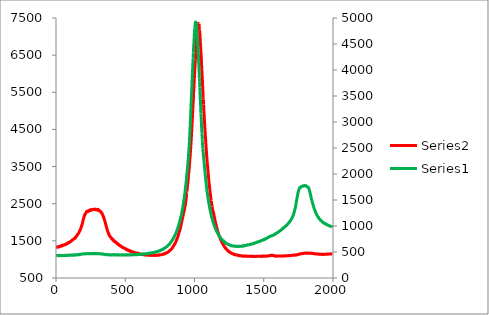
| Category | Series 5 |
|---|---|
| 0.0 | 1324.341 |
| 1.6 | 1326.57 |
| 3.2 | 1333.722 |
| 4.800000000000001 | 1335.591 |
| 6.4 | 1329.403 |
| 8.0 | 1330.224 |
| 9.600000000000001 | 1332.106 |
| 11.200000000000001 | 1327.205 |
| 12.8 | 1332.421 |
| 14.4 | 1339.326 |
| 16.0 | 1337.66 |
| 17.6 | 1343.187 |
| 19.200000000000003 | 1335.721 |
| 20.8 | 1338.657 |
| 22.400000000000002 | 1347.698 |
| 24.0 | 1349.644 |
| 25.6 | 1342.042 |
| 27.200000000000003 | 1355.066 |
| 28.8 | 1350.707 |
| 30.400000000000002 | 1349.752 |
| 32.0 | 1359.852 |
| 33.6 | 1351.822 |
| 35.2 | 1358.466 |
| 36.800000000000004 | 1359.272 |
| 38.400000000000006 | 1364.168 |
| 40.0 | 1372.816 |
| 41.6 | 1372.552 |
| 43.2 | 1370.27 |
| 44.800000000000004 | 1366.832 |
| 46.400000000000006 | 1384.65 |
| 48.0 | 1375.282 |
| 49.6 | 1381.134 |
| 51.2 | 1377.741 |
| 52.800000000000004 | 1381.258 |
| 54.400000000000006 | 1390.318 |
| 56.0 | 1385.906 |
| 57.6 | 1388.036 |
| 59.2 | 1390.409 |
| 60.800000000000004 | 1390.847 |
| 62.400000000000006 | 1395.918 |
| 64.0 | 1395.008 |
| 65.60000000000001 | 1403.968 |
| 67.2 | 1411.637 |
| 68.8 | 1410.423 |
| 70.4 | 1406.29 |
| 72.0 | 1400.998 |
| 73.60000000000001 | 1408.75 |
| 75.2 | 1419.637 |
| 76.80000000000001 | 1420.764 |
| 78.4 | 1422.688 |
| 80.0 | 1426.918 |
| 81.60000000000001 | 1434.733 |
| 83.2 | 1438.332 |
| 84.80000000000001 | 1427.938 |
| 86.4 | 1438.434 |
| 88.0 | 1437.954 |
| 89.60000000000001 | 1454.275 |
| 91.2 | 1451.526 |
| 92.80000000000001 | 1451.974 |
| 94.4 | 1459.619 |
| 96.0 | 1463.713 |
| 97.60000000000001 | 1460.511 |
| 99.2 | 1471.008 |
| 100.80000000000001 | 1470.978 |
| 102.4 | 1472.253 |
| 104.0 | 1479.637 |
| 105.60000000000001 | 1489.19 |
| 107.2 | 1485.202 |
| 108.80000000000001 | 1491.216 |
| 110.4 | 1491.536 |
| 112.0 | 1500.481 |
| 113.60000000000001 | 1499.62 |
| 115.2 | 1507.443 |
| 116.80000000000001 | 1522.002 |
| 118.4 | 1518.037 |
| 120.0 | 1525.903 |
| 121.60000000000001 | 1533.27 |
| 123.2 | 1535.716 |
| 124.80000000000001 | 1537.775 |
| 126.4 | 1542.262 |
| 128.0 | 1545.485 |
| 129.6 | 1546.73 |
| 131.20000000000002 | 1559.718 |
| 132.8 | 1568.369 |
| 134.4 | 1577.265 |
| 136.0 | 1575.478 |
| 137.6 | 1581.012 |
| 139.20000000000002 | 1572.298 |
| 140.8 | 1594.202 |
| 142.4 | 1601.198 |
| 144.0 | 1607.495 |
| 145.6 | 1612.786 |
| 147.20000000000002 | 1622.685 |
| 148.8 | 1624.009 |
| 150.4 | 1641.332 |
| 152.0 | 1654.599 |
| 153.60000000000002 | 1661.69 |
| 155.20000000000002 | 1666.176 |
| 156.8 | 1674.4 |
| 158.4 | 1679.424 |
| 160.0 | 1691.205 |
| 161.60000000000002 | 1696.826 |
| 163.20000000000002 | 1710.934 |
| 164.8 | 1715.19 |
| 166.4 | 1727.58 |
| 168.0 | 1741.528 |
| 169.60000000000002 | 1756.216 |
| 171.20000000000002 | 1774.472 |
| 172.8 | 1773.262 |
| 174.4 | 1790.864 |
| 176.0 | 1806.335 |
| 177.60000000000002 | 1821.769 |
| 179.20000000000002 | 1837.88 |
| 180.8 | 1861.466 |
| 182.4 | 1871.338 |
| 184.0 | 1904.16 |
| 185.60000000000002 | 1910.105 |
| 187.20000000000002 | 1918.326 |
| 188.8 | 1949.704 |
| 190.4 | 1968.485 |
| 192.0 | 2008.512 |
| 193.60000000000002 | 2014.827 |
| 195.20000000000002 | 2047.869 |
| 196.8 | 2072.574 |
| 198.4 | 2105.614 |
| 200.0 | 2112.448 |
| 201.60000000000002 | 2138.054 |
| 203.20000000000002 | 2160.148 |
| 204.8 | 2168.116 |
| 206.4 | 2191.64 |
| 208.0 | 2213.401 |
| 209.60000000000002 | 2218.988 |
| 211.20000000000002 | 2216.191 |
| 212.8 | 2234.648 |
| 214.4 | 2240.574 |
| 216.0 | 2249.847 |
| 217.60000000000002 | 2259.454 |
| 219.20000000000002 | 2277.722 |
| 220.8 | 2290.735 |
| 222.4 | 2283.333 |
| 224.0 | 2296.376 |
| 225.60000000000002 | 2293.815 |
| 227.20000000000002 | 2287.881 |
| 228.8 | 2296.412 |
| 230.4 | 2299.645 |
| 232.0 | 2306.858 |
| 233.60000000000002 | 2291.586 |
| 235.20000000000002 | 2301.935 |
| 236.8 | 2306.563 |
| 238.4 | 2305.196 |
| 240.0 | 2317.256 |
| 241.60000000000002 | 2325.503 |
| 243.20000000000002 | 2329.208 |
| 244.8 | 2324.063 |
| 246.4 | 2320.741 |
| 248.0 | 2339.082 |
| 249.60000000000002 | 2329.952 |
| 251.20000000000002 | 2326.417 |
| 252.8 | 2321.756 |
| 254.4 | 2338.04 |
| 256.0 | 2340.27 |
| 257.6 | 2335.792 |
| 259.2 | 2344.923 |
| 260.8 | 2337.247 |
| 262.40000000000003 | 2337.164 |
| 264.0 | 2345.56 |
| 265.6 | 2342.88 |
| 267.2 | 2340.491 |
| 268.8 | 2338.908 |
| 270.40000000000003 | 2347.08 |
| 272.0 | 2348.049 |
| 273.6 | 2353.1 |
| 275.2 | 2344.894 |
| 276.8 | 2344.765 |
| 278.40000000000003 | 2348.178 |
| 280.0 | 2347.974 |
| 281.6 | 2350.356 |
| 283.2 | 2356.236 |
| 284.8 | 2348.687 |
| 286.40000000000003 | 2351.279 |
| 288.0 | 2343.963 |
| 289.6 | 2346.088 |
| 291.2 | 2329.069 |
| 292.8 | 2336.701 |
| 294.40000000000003 | 2341.272 |
| 296.0 | 2337.596 |
| 297.6 | 2341.08 |
| 299.2 | 2331.138 |
| 300.8 | 2340.833 |
| 302.40000000000003 | 2327.022 |
| 304.0 | 2349.039 |
| 305.6 | 2331.014 |
| 307.20000000000005 | 2331.934 |
| 308.8 | 2328.81 |
| 310.40000000000003 | 2309.239 |
| 312.0 | 2322.295 |
| 313.6 | 2304.965 |
| 315.20000000000005 | 2302.066 |
| 316.8 | 2309.644 |
| 318.40000000000003 | 2301.216 |
| 320.0 | 2301.114 |
| 321.6 | 2293.679 |
| 323.20000000000005 | 2277.085 |
| 324.8 | 2272.066 |
| 326.40000000000003 | 2270.261 |
| 328.0 | 2256.552 |
| 329.6 | 2248.376 |
| 331.20000000000005 | 2247.178 |
| 332.8 | 2232.44 |
| 334.40000000000003 | 2221.242 |
| 336.0 | 2211.995 |
| 337.6 | 2201.296 |
| 339.20000000000005 | 2166.758 |
| 340.8 | 2165.451 |
| 342.40000000000003 | 2157.285 |
| 344.0 | 2134.909 |
| 345.6 | 2110.182 |
| 347.20000000000005 | 2100.73 |
| 348.8 | 2073.644 |
| 350.40000000000003 | 2062.537 |
| 352.0 | 2038.525 |
| 353.6 | 2022.318 |
| 355.20000000000005 | 2000.674 |
| 356.8 | 1983.594 |
| 358.40000000000003 | 1951.045 |
| 360.0 | 1937.364 |
| 361.6 | 1910.355 |
| 363.20000000000005 | 1886.389 |
| 364.8 | 1862.691 |
| 366.40000000000003 | 1847.719 |
| 368.0 | 1813.714 |
| 369.6 | 1803.546 |
| 371.20000000000005 | 1784.988 |
| 372.8 | 1752.58 |
| 374.40000000000003 | 1743.131 |
| 376.0 | 1729.27 |
| 377.6 | 1716.48 |
| 379.20000000000005 | 1694.377 |
| 380.8 | 1688.111 |
| 382.40000000000003 | 1686.258 |
| 384.0 | 1656.023 |
| 385.6 | 1640.846 |
| 387.20000000000005 | 1632.377 |
| 388.8 | 1630.903 |
| 390.40000000000003 | 1619.094 |
| 392.0 | 1615.142 |
| 393.6 | 1605.597 |
| 395.20000000000005 | 1598.903 |
| 396.8 | 1584.915 |
| 398.40000000000003 | 1578.512 |
| 400.0 | 1570.286 |
| 401.6 | 1564.241 |
| 403.20000000000005 | 1549.062 |
| 404.8 | 1554.793 |
| 406.40000000000003 | 1540.039 |
| 408.0 | 1551.816 |
| 409.6 | 1534.42 |
| 411.20000000000005 | 1537.259 |
| 412.8 | 1511.648 |
| 414.40000000000003 | 1509.086 |
| 416.0 | 1507.205 |
| 417.6 | 1495.531 |
| 419.20000000000005 | 1502.13 |
| 420.8 | 1486.435 |
| 422.40000000000003 | 1486.782 |
| 424.0 | 1482.877 |
| 425.6 | 1469.866 |
| 427.20000000000005 | 1466.395 |
| 428.8 | 1473.051 |
| 430.40000000000003 | 1471.897 |
| 432.0 | 1469.366 |
| 433.6 | 1458.806 |
| 435.20000000000005 | 1455.588 |
| 436.8 | 1449.995 |
| 438.40000000000003 | 1441.219 |
| 440.0 | 1438.059 |
| 441.6 | 1422.728 |
| 443.20000000000005 | 1428.178 |
| 444.8 | 1419.941 |
| 446.40000000000003 | 1416.731 |
| 448.0 | 1409.21 |
| 449.6 | 1396.423 |
| 451.20000000000005 | 1411.684 |
| 452.8 | 1392.318 |
| 454.40000000000003 | 1394.022 |
| 456.0 | 1389.702 |
| 457.6 | 1380.086 |
| 459.20000000000005 | 1377.704 |
| 460.8 | 1369.318 |
| 462.40000000000003 | 1363.821 |
| 464.0 | 1363.144 |
| 465.6 | 1372.739 |
| 467.20000000000005 | 1360.059 |
| 468.8 | 1360.622 |
| 470.40000000000003 | 1349.421 |
| 472.0 | 1352.184 |
| 473.6 | 1340.684 |
| 475.20000000000005 | 1334.44 |
| 476.8 | 1334.042 |
| 478.40000000000003 | 1330.157 |
| 480.0 | 1327.19 |
| 481.6 | 1323.409 |
| 483.20000000000005 | 1317.002 |
| 484.8 | 1317.693 |
| 486.40000000000003 | 1321.31 |
| 488.0 | 1313.551 |
| 489.6 | 1307.94 |
| 491.20000000000005 | 1305.878 |
| 492.8 | 1300.816 |
| 494.40000000000003 | 1302.537 |
| 496.0 | 1296.818 |
| 497.6 | 1297.545 |
| 499.20000000000005 | 1291.748 |
| 500.8 | 1282.258 |
| 502.40000000000003 | 1285.335 |
| 504.0 | 1278.256 |
| 505.6 | 1274.502 |
| 507.20000000000005 | 1266.523 |
| 508.8 | 1278.469 |
| 510.40000000000003 | 1271.57 |
| 512.0 | 1258.571 |
| 513.6 | 1261.935 |
| 515.2 | 1257.892 |
| 516.8000000000001 | 1258.489 |
| 518.4 | 1250.665 |
| 520.0 | 1244.727 |
| 521.6 | 1237.711 |
| 523.2 | 1249.801 |
| 524.8000000000001 | 1237.062 |
| 526.4 | 1250.86 |
| 528.0 | 1238.012 |
| 529.6 | 1227.96 |
| 531.2 | 1236.262 |
| 532.8000000000001 | 1231.512 |
| 534.4 | 1220.492 |
| 536.0 | 1225.015 |
| 537.6 | 1221.742 |
| 539.2 | 1210.481 |
| 540.8000000000001 | 1212.85 |
| 542.4 | 1212.656 |
| 544.0 | 1205.505 |
| 545.6 | 1212.971 |
| 547.2 | 1207.179 |
| 548.8000000000001 | 1213.144 |
| 550.4 | 1207.417 |
| 552.0 | 1195.94 |
| 553.6 | 1202.159 |
| 555.2 | 1194.106 |
| 556.8000000000001 | 1197.954 |
| 558.4 | 1191.949 |
| 560.0 | 1187.108 |
| 561.6 | 1190.256 |
| 563.2 | 1187.975 |
| 564.8000000000001 | 1190.068 |
| 566.4 | 1184.062 |
| 568.0 | 1184.596 |
| 569.6 | 1183.281 |
| 571.2 | 1180.103 |
| 572.8000000000001 | 1175.653 |
| 574.4 | 1173.162 |
| 576.0 | 1173.214 |
| 577.6 | 1167.017 |
| 579.2 | 1167.634 |
| 580.8000000000001 | 1168.583 |
| 582.4 | 1174.724 |
| 584.0 | 1161.563 |
| 585.6 | 1166.593 |
| 587.2 | 1165.992 |
| 588.8000000000001 | 1162.207 |
| 590.4 | 1173.62 |
| 592.0 | 1156.441 |
| 593.6 | 1158.125 |
| 595.2 | 1154.097 |
| 596.8000000000001 | 1150.214 |
| 598.4 | 1153.62 |
| 600.0 | 1148.096 |
| 601.6 | 1145.387 |
| 603.2 | 1145.506 |
| 604.8000000000001 | 1149.952 |
| 606.4 | 1147.673 |
| 608.0 | 1147.051 |
| 609.6 | 1141.684 |
| 611.2 | 1144.981 |
| 612.8000000000001 | 1140.011 |
| 614.4000000000001 | 1140.818 |
| 616.0 | 1137.707 |
| 617.6 | 1133.721 |
| 619.2 | 1139.71 |
| 620.8000000000001 | 1138.994 |
| 622.4000000000001 | 1133.344 |
| 624.0 | 1134.301 |
| 625.6 | 1128.097 |
| 627.2 | 1135.804 |
| 628.8000000000001 | 1133.31 |
| 630.4000000000001 | 1130.003 |
| 632.0 | 1128.461 |
| 633.6 | 1128.526 |
| 635.2 | 1126.515 |
| 636.8000000000001 | 1126.31 |
| 638.4000000000001 | 1120.469 |
| 640.0 | 1131.829 |
| 641.6 | 1123.173 |
| 643.2 | 1125.866 |
| 644.8000000000001 | 1118.653 |
| 646.4000000000001 | 1122.052 |
| 648.0 | 1123.557 |
| 649.6 | 1120.332 |
| 651.2 | 1117.395 |
| 652.8000000000001 | 1123.796 |
| 654.4000000000001 | 1114.923 |
| 656.0 | 1121.455 |
| 657.6 | 1123.778 |
| 659.2 | 1116.543 |
| 660.8000000000001 | 1125.202 |
| 662.4000000000001 | 1118.429 |
| 664.0 | 1122.344 |
| 665.6 | 1110.485 |
| 667.2 | 1112.926 |
| 668.8000000000001 | 1113.509 |
| 670.4000000000001 | 1112.738 |
| 672.0 | 1116.861 |
| 673.6 | 1111.326 |
| 675.2 | 1109.602 |
| 676.8000000000001 | 1114.298 |
| 678.4000000000001 | 1113.117 |
| 680.0 | 1114.045 |
| 681.6 | 1114.299 |
| 683.2 | 1112.414 |
| 684.8000000000001 | 1106.193 |
| 686.4000000000001 | 1110.193 |
| 688.0 | 1116.644 |
| 689.6 | 1110.971 |
| 691.2 | 1110.702 |
| 692.8000000000001 | 1112.748 |
| 694.4000000000001 | 1113.909 |
| 696.0 | 1113.593 |
| 697.6 | 1110.063 |
| 699.2 | 1109.877 |
| 700.8000000000001 | 1106.66 |
| 702.4000000000001 | 1113.233 |
| 704.0 | 1110.793 |
| 705.6 | 1112.557 |
| 707.2 | 1113.472 |
| 708.8000000000001 | 1110.591 |
| 710.4000000000001 | 1110.106 |
| 712.0 | 1106.699 |
| 713.6 | 1115.154 |
| 715.2 | 1110.454 |
| 716.8000000000001 | 1118.105 |
| 718.4000000000001 | 1112.742 |
| 720.0 | 1109.634 |
| 721.6 | 1116.35 |
| 723.2 | 1112.909 |
| 724.8000000000001 | 1106.961 |
| 726.4000000000001 | 1111.336 |
| 728.0 | 1109.159 |
| 729.6 | 1118.247 |
| 731.2 | 1116.65 |
| 732.8000000000001 | 1115.474 |
| 734.4000000000001 | 1118.415 |
| 736.0 | 1115.156 |
| 737.6 | 1114.722 |
| 739.2 | 1122.523 |
| 740.8000000000001 | 1117.448 |
| 742.4000000000001 | 1112.485 |
| 744.0 | 1117.969 |
| 745.6 | 1120.466 |
| 747.2 | 1124.566 |
| 748.8000000000001 | 1119.57 |
| 750.4000000000001 | 1124.179 |
| 752.0 | 1122.167 |
| 753.6 | 1124.31 |
| 755.2 | 1123.608 |
| 756.8000000000001 | 1123.764 |
| 758.4000000000001 | 1127.619 |
| 760.0 | 1127.134 |
| 761.6 | 1126.162 |
| 763.2 | 1131.347 |
| 764.8000000000001 | 1134.424 |
| 766.4000000000001 | 1133.637 |
| 768.0 | 1132.946 |
| 769.6 | 1139.532 |
| 771.2 | 1143.372 |
| 772.8000000000001 | 1145.512 |
| 774.4000000000001 | 1137.457 |
| 776.0 | 1145.119 |
| 777.6 | 1141.659 |
| 779.2 | 1143.123 |
| 780.8000000000001 | 1147.918 |
| 782.4000000000001 | 1149.554 |
| 784.0 | 1157.025 |
| 785.6 | 1151.923 |
| 787.2 | 1150.883 |
| 788.8000000000001 | 1157.344 |
| 790.4000000000001 | 1159.046 |
| 792.0 | 1167.952 |
| 793.6 | 1174.545 |
| 795.2 | 1176.767 |
| 796.8000000000001 | 1175.886 |
| 798.4000000000001 | 1182.998 |
| 800.0 | 1182.301 |
| 801.6 | 1179.917 |
| 803.2 | 1186.671 |
| 804.8000000000001 | 1193.252 |
| 806.4000000000001 | 1195.448 |
| 808.0 | 1192.282 |
| 809.6 | 1201.16 |
| 811.2 | 1207.969 |
| 812.8000000000001 | 1209.377 |
| 814.4000000000001 | 1217.647 |
| 816.0 | 1215.847 |
| 817.6 | 1227.093 |
| 819.2 | 1229.492 |
| 820.8000000000001 | 1236.201 |
| 822.4000000000001 | 1243.637 |
| 824.0 | 1242.184 |
| 825.6 | 1252.699 |
| 827.2 | 1254.602 |
| 828.8000000000001 | 1265.224 |
| 830.4000000000001 | 1271.231 |
| 832.0 | 1276.009 |
| 833.6 | 1281.489 |
| 835.2 | 1287.952 |
| 836.8000000000001 | 1291.767 |
| 838.4000000000001 | 1302.85 |
| 840.0 | 1308.042 |
| 841.6 | 1318.299 |
| 843.2 | 1331.849 |
| 844.8000000000001 | 1341.542 |
| 846.4000000000001 | 1354.292 |
| 848.0 | 1366.134 |
| 849.6 | 1360.248 |
| 851.2 | 1380.832 |
| 852.8000000000001 | 1392.57 |
| 854.4000000000001 | 1405.356 |
| 856.0 | 1409.386 |
| 857.6 | 1422.633 |
| 859.2 | 1428.394 |
| 860.8000000000001 | 1436.333 |
| 862.4000000000001 | 1446.934 |
| 864.0 | 1464.957 |
| 865.6 | 1482.611 |
| 867.2 | 1494.525 |
| 868.8000000000001 | 1505.36 |
| 870.4000000000001 | 1520.554 |
| 872.0 | 1532.719 |
| 873.6 | 1554.497 |
| 875.2 | 1570.525 |
| 876.8000000000001 | 1579.35 |
| 878.4000000000001 | 1601.262 |
| 880.0 | 1617.694 |
| 881.6 | 1632.253 |
| 883.2 | 1650.972 |
| 884.8000000000001 | 1674.863 |
| 886.4000000000001 | 1695.739 |
| 888.0 | 1710.602 |
| 889.6 | 1736.113 |
| 891.2 | 1755.228 |
| 892.8000000000001 | 1768.202 |
| 894.4000000000001 | 1786.667 |
| 896.0 | 1814.582 |
| 897.6 | 1836.978 |
| 899.2 | 1865.799 |
| 900.8000000000001 | 1891.062 |
| 902.4000000000001 | 1911.338 |
| 904.0 | 1949.403 |
| 905.6 | 1974.511 |
| 907.2 | 1996.12 |
| 908.8000000000001 | 2032.36 |
| 910.4000000000001 | 2058.148 |
| 912.0 | 2085.619 |
| 913.6 | 2109.148 |
| 915.2 | 2147.164 |
| 916.8000000000001 | 2165.526 |
| 918.4000000000001 | 2203.256 |
| 920.0 | 2219.091 |
| 921.6 | 2253.181 |
| 923.2 | 2291.034 |
| 924.8000000000001 | 2297.361 |
| 926.4000000000001 | 2335.269 |
| 928.0 | 2357.052 |
| 929.6 | 2401.367 |
| 931.2 | 2437.034 |
| 932.8000000000001 | 2447.381 |
| 934.4000000000001 | 2489.181 |
| 936.0 | 2543.378 |
| 937.6 | 2584.336 |
| 939.2 | 2636.193 |
| 940.8000000000001 | 2671.869 |
| 942.4000000000001 | 2759.461 |
| 944.0 | 2816.289 |
| 945.6 | 2822.052 |
| 947.2 | 2899.225 |
| 948.8000000000001 | 2972.963 |
| 950.4000000000001 | 3030.292 |
| 952.0 | 3062.046 |
| 953.6 | 3118.852 |
| 955.2 | 3203.572 |
| 956.8000000000001 | 3275.398 |
| 958.4000000000001 | 3328.854 |
| 960.0 | 3375.849 |
| 961.6 | 3458.765 |
| 963.2 | 3527.62 |
| 964.8000000000001 | 3599.424 |
| 966.4000000000001 | 3697.094 |
| 968.0 | 3747.724 |
| 969.6 | 3845.84 |
| 971.2 | 3921.835 |
| 972.8000000000001 | 4005.963 |
| 974.4000000000001 | 4133.694 |
| 976.0 | 4209.918 |
| 977.6 | 4306.622 |
| 979.2 | 4429.23 |
| 980.8000000000001 | 4548.318 |
| 982.4000000000001 | 4659.918 |
| 984.0 | 4757.301 |
| 985.6 | 4881.557 |
| 987.2 | 4988.446 |
| 988.8000000000001 | 5116.168 |
| 990.4000000000001 | 5229.016 |
| 992.0 | 5341.854 |
| 993.6 | 5492.117 |
| 995.2 | 5584.961 |
| 996.8000000000001 | 5719.781 |
| 998.4000000000001 | 5844.003 |
| 1000.0 | 5946.714 |
| 1001.6 | 6064.936 |
| 1003.2 | 6178.662 |
| 1004.8000000000001 | 6297.387 |
| 1006.4000000000001 | 6375.176 |
| 1008.0 | 6535.298 |
| 1009.6 | 6631.468 |
| 1011.2 | 6696.746 |
| 1012.8000000000001 | 6804.148 |
| 1014.4000000000001 | 6902.571 |
| 1016.0 | 6986.086 |
| 1017.6 | 7090.739 |
| 1019.2 | 7126.137 |
| 1020.8000000000001 | 7222.126 |
| 1022.4000000000001 | 7281.543 |
| 1024.0 | 7309.779 |
| 1025.6000000000001 | 7318.963 |
| 1027.2 | 7356.089 |
| 1028.8 | 7335.31 |
| 1030.4 | 7319.58 |
| 1032.0 | 7344.58 |
| 1033.6000000000001 | 7286.974 |
| 1035.2 | 7176.776 |
| 1036.8 | 7170.431 |
| 1038.4 | 7105.011 |
| 1040.0 | 7009.5 |
| 1041.6000000000001 | 6875.248 |
| 1043.2 | 6796.153 |
| 1044.8 | 6683.736 |
| 1046.4 | 6570.556 |
| 1048.0 | 6482.707 |
| 1049.6000000000001 | 6365.545 |
| 1051.2 | 6222.994 |
| 1052.8 | 6124.312 |
| 1054.4 | 5991.705 |
| 1056.0 | 5897.483 |
| 1057.6000000000001 | 5759.557 |
| 1059.2 | 5646.815 |
| 1060.8 | 5523.941 |
| 1062.4 | 5352.983 |
| 1064.0 | 5300.514 |
| 1065.6000000000001 | 5171.406 |
| 1067.2 | 5043.278 |
| 1068.8 | 4928.404 |
| 1070.4 | 4848.497 |
| 1072.0 | 4721.233 |
| 1073.6000000000001 | 4638.157 |
| 1075.2 | 4516.516 |
| 1076.8 | 4429.823 |
| 1078.4 | 4311.867 |
| 1080.0 | 4248.861 |
| 1081.6000000000001 | 4151.014 |
| 1083.2 | 4047.09 |
| 1084.8 | 3967.604 |
| 1086.4 | 3873.515 |
| 1088.0 | 3802.812 |
| 1089.6000000000001 | 3723.068 |
| 1091.2 | 3642.881 |
| 1092.8 | 3559.165 |
| 1094.4 | 3523.211 |
| 1096.0 | 3444.429 |
| 1097.6000000000001 | 3368.847 |
| 1099.2 | 3300.785 |
| 1100.8 | 3241.75 |
| 1102.4 | 3175.258 |
| 1104.0 | 3098.398 |
| 1105.6000000000001 | 3040.688 |
| 1107.2 | 3007.662 |
| 1108.8 | 2940.245 |
| 1110.4 | 2886.002 |
| 1112.0 | 2822.006 |
| 1113.6000000000001 | 2785.079 |
| 1115.2 | 2752.136 |
| 1116.8 | 2678.046 |
| 1118.4 | 2633.682 |
| 1120.0 | 2587.606 |
| 1121.6000000000001 | 2579.571 |
| 1123.2 | 2488.162 |
| 1124.8 | 2491.798 |
| 1126.4 | 2427.048 |
| 1128.0 | 2400.813 |
| 1129.6000000000001 | 2351.874 |
| 1131.2 | 2338.211 |
| 1132.8 | 2313.586 |
| 1134.4 | 2287.042 |
| 1136.0 | 2266.332 |
| 1137.6000000000001 | 2247.591 |
| 1139.2 | 2212.767 |
| 1140.8 | 2187.781 |
| 1142.4 | 2148.73 |
| 1144.0 | 2133.679 |
| 1145.6000000000001 | 2100.932 |
| 1147.2 | 2070.61 |
| 1148.8 | 2050.573 |
| 1150.4 | 2008.492 |
| 1152.0 | 1992.917 |
| 1153.6000000000001 | 1959.404 |
| 1155.2 | 1931.134 |
| 1156.8 | 1926.928 |
| 1158.4 | 1880.98 |
| 1160.0 | 1863.341 |
| 1161.6000000000001 | 1832.779 |
| 1163.2 | 1820.44 |
| 1164.8 | 1796.191 |
| 1166.4 | 1774.887 |
| 1168.0 | 1753.923 |
| 1169.6000000000001 | 1737.503 |
| 1171.2 | 1720.336 |
| 1172.8 | 1691.841 |
| 1174.4 | 1673.343 |
| 1176.0 | 1663.639 |
| 1177.6000000000001 | 1646.846 |
| 1179.2 | 1621.441 |
| 1180.8 | 1610.64 |
| 1182.4 | 1599.142 |
| 1184.0 | 1592.468 |
| 1185.6000000000001 | 1568.4 |
| 1187.2 | 1545.373 |
| 1188.8 | 1547.687 |
| 1190.4 | 1524.617 |
| 1192.0 | 1506.42 |
| 1193.6000000000001 | 1500.568 |
| 1195.2 | 1484.153 |
| 1196.8 | 1464.457 |
| 1198.4 | 1461.133 |
| 1200.0 | 1450.44 |
| 1201.6000000000001 | 1439.017 |
| 1203.2 | 1423.844 |
| 1204.8 | 1410.103 |
| 1206.4 | 1400.678 |
| 1208.0 | 1393.287 |
| 1209.6000000000001 | 1380.171 |
| 1211.2 | 1375.333 |
| 1212.8 | 1360.619 |
| 1214.4 | 1356.463 |
| 1216.0 | 1343.506 |
| 1217.6000000000001 | 1340.73 |
| 1219.2 | 1323.565 |
| 1220.8 | 1317.313 |
| 1222.4 | 1309.356 |
| 1224.0 | 1299.631 |
| 1225.6000000000001 | 1301.255 |
| 1227.2 | 1299.761 |
| 1228.8000000000002 | 1277.739 |
| 1230.4 | 1280.19 |
| 1232.0 | 1267.284 |
| 1233.6000000000001 | 1263.42 |
| 1235.2 | 1261.299 |
| 1236.8000000000002 | 1246.142 |
| 1238.4 | 1249.329 |
| 1240.0 | 1233.61 |
| 1241.6000000000001 | 1232.958 |
| 1243.2 | 1226.707 |
| 1244.8000000000002 | 1218.583 |
| 1246.4 | 1222.116 |
| 1248.0 | 1217.142 |
| 1249.6000000000001 | 1207.793 |
| 1251.2 | 1201.444 |
| 1252.8000000000002 | 1201.983 |
| 1254.4 | 1194.816 |
| 1256.0 | 1191.532 |
| 1257.6000000000001 | 1187.765 |
| 1259.2 | 1184.178 |
| 1260.8000000000002 | 1181.011 |
| 1262.4 | 1179.812 |
| 1264.0 | 1172.576 |
| 1265.6000000000001 | 1167.593 |
| 1267.2 | 1168.926 |
| 1268.8000000000002 | 1162.694 |
| 1270.4 | 1162.329 |
| 1272.0 | 1159.355 |
| 1273.6000000000001 | 1156.221 |
| 1275.2 | 1152.778 |
| 1276.8000000000002 | 1153.633 |
| 1278.4 | 1145.322 |
| 1280.0 | 1145.596 |
| 1281.6000000000001 | 1144.591 |
| 1283.2 | 1138.61 |
| 1284.8000000000002 | 1132.835 |
| 1286.4 | 1140.313 |
| 1288.0 | 1135.645 |
| 1289.6000000000001 | 1135.12 |
| 1291.2 | 1130.176 |
| 1292.8000000000002 | 1134.517 |
| 1294.4 | 1124.444 |
| 1296.0 | 1124.687 |
| 1297.6000000000001 | 1126.116 |
| 1299.2 | 1121.674 |
| 1300.8000000000002 | 1121.761 |
| 1302.4 | 1116.86 |
| 1304.0 | 1118.89 |
| 1305.6000000000001 | 1117.059 |
| 1307.2 | 1112.231 |
| 1308.8000000000002 | 1119.077 |
| 1310.4 | 1112.844 |
| 1312.0 | 1108.89 |
| 1313.6000000000001 | 1109.438 |
| 1315.2 | 1108.741 |
| 1316.8000000000002 | 1114.693 |
| 1318.4 | 1107.822 |
| 1320.0 | 1101.73 |
| 1321.6000000000001 | 1101.636 |
| 1323.2 | 1103.895 |
| 1324.8000000000002 | 1102.958 |
| 1326.4 | 1101.483 |
| 1328.0 | 1099.61 |
| 1329.6000000000001 | 1103.204 |
| 1331.2 | 1097.6 |
| 1332.8000000000002 | 1100.179 |
| 1334.4 | 1097.787 |
| 1336.0 | 1098.256 |
| 1337.6000000000001 | 1096.84 |
| 1339.2 | 1094.145 |
| 1340.8000000000002 | 1094.367 |
| 1342.4 | 1098.477 |
| 1344.0 | 1093.556 |
| 1345.6000000000001 | 1092.347 |
| 1347.2 | 1089.924 |
| 1348.8000000000002 | 1090.679 |
| 1350.4 | 1087.645 |
| 1352.0 | 1090.461 |
| 1353.6000000000001 | 1086.721 |
| 1355.2 | 1094.236 |
| 1356.8000000000002 | 1084.228 |
| 1358.4 | 1094.304 |
| 1360.0 | 1084.14 |
| 1361.6000000000001 | 1087.642 |
| 1363.2 | 1090.37 |
| 1364.8000000000002 | 1088.9 |
| 1366.4 | 1086.789 |
| 1368.0 | 1091.238 |
| 1369.6000000000001 | 1085.798 |
| 1371.2 | 1089.806 |
| 1372.8000000000002 | 1088.083 |
| 1374.4 | 1086.17 |
| 1376.0 | 1093.19 |
| 1377.6000000000001 | 1083.381 |
| 1379.2 | 1084.812 |
| 1380.8000000000002 | 1082.772 |
| 1382.4 | 1082.06 |
| 1384.0 | 1086.73 |
| 1385.6000000000001 | 1087.327 |
| 1387.2 | 1085.214 |
| 1388.8000000000002 | 1084.756 |
| 1390.4 | 1084.928 |
| 1392.0 | 1083.204 |
| 1393.6000000000001 | 1086.008 |
| 1395.2 | 1087.091 |
| 1396.8000000000002 | 1089.841 |
| 1398.4 | 1085.026 |
| 1400.0 | 1086.208 |
| 1401.6000000000001 | 1086.409 |
| 1403.2 | 1080.755 |
| 1404.8000000000002 | 1083.284 |
| 1406.4 | 1080.82 |
| 1408.0 | 1082.528 |
| 1409.6000000000001 | 1079.787 |
| 1411.2 | 1083.637 |
| 1412.8000000000002 | 1081.92 |
| 1414.4 | 1085.256 |
| 1416.0 | 1081.799 |
| 1417.6000000000001 | 1086.272 |
| 1419.2 | 1084.597 |
| 1420.8000000000002 | 1082.036 |
| 1422.4 | 1084.034 |
| 1424.0 | 1080.599 |
| 1425.6000000000001 | 1080.849 |
| 1427.2 | 1079.716 |
| 1428.8000000000002 | 1084.525 |
| 1430.4 | 1083.276 |
| 1432.0 | 1081.568 |
| 1433.6000000000001 | 1084.948 |
| 1435.2 | 1082.031 |
| 1436.8000000000002 | 1078.659 |
| 1438.4 | 1078.394 |
| 1440.0 | 1077.755 |
| 1441.6000000000001 | 1080.731 |
| 1443.2 | 1079.736 |
| 1444.8000000000002 | 1081.454 |
| 1446.4 | 1080.015 |
| 1448.0 | 1078.648 |
| 1449.6000000000001 | 1086.407 |
| 1451.2 | 1084.477 |
| 1452.8000000000002 | 1084.809 |
| 1454.4 | 1084.951 |
| 1456.0 | 1086.705 |
| 1457.6000000000001 | 1086.475 |
| 1459.2 | 1082.963 |
| 1460.8000000000002 | 1082.072 |
| 1462.4 | 1084.731 |
| 1464.0 | 1087.39 |
| 1465.6000000000001 | 1082.944 |
| 1467.2 | 1083.887 |
| 1468.8000000000002 | 1084.56 |
| 1470.4 | 1081.91 |
| 1472.0 | 1087.748 |
| 1473.6000000000001 | 1087.006 |
| 1475.2 | 1081.591 |
| 1476.8000000000002 | 1085.73 |
| 1478.4 | 1082.218 |
| 1480.0 | 1084.92 |
| 1481.6000000000001 | 1081.869 |
| 1483.2 | 1090.341 |
| 1484.8000000000002 | 1087.247 |
| 1486.4 | 1086.434 |
| 1488.0 | 1085.744 |
| 1489.6000000000001 | 1090.83 |
| 1491.2 | 1087.654 |
| 1492.8000000000002 | 1081.239 |
| 1494.4 | 1085.688 |
| 1496.0 | 1087.086 |
| 1497.6000000000001 | 1090.279 |
| 1499.2 | 1088.113 |
| 1500.8000000000002 | 1083.611 |
| 1502.4 | 1086.826 |
| 1504.0 | 1088.286 |
| 1505.6000000000001 | 1092.944 |
| 1507.2 | 1088.4 |
| 1508.8000000000002 | 1089.5 |
| 1510.4 | 1086.887 |
| 1512.0 | 1089.105 |
| 1513.6000000000001 | 1088.961 |
| 1515.2 | 1090.241 |
| 1516.8000000000002 | 1090.816 |
| 1518.4 | 1088.816 |
| 1520.0 | 1089.75 |
| 1521.6000000000001 | 1088.676 |
| 1523.2 | 1085.015 |
| 1524.8000000000002 | 1089.036 |
| 1526.4 | 1089.46 |
| 1528.0 | 1093.802 |
| 1529.6000000000001 | 1089.67 |
| 1531.2 | 1093.738 |
| 1532.8000000000002 | 1093.509 |
| 1534.4 | 1096.046 |
| 1536.0 | 1100.682 |
| 1537.6000000000001 | 1094.361 |
| 1539.2 | 1098.353 |
| 1540.8000000000002 | 1103.137 |
| 1542.4 | 1101.298 |
| 1544.0 | 1106.335 |
| 1545.6000000000001 | 1105.863 |
| 1547.2 | 1106.778 |
| 1548.8000000000002 | 1107.574 |
| 1550.4 | 1111.253 |
| 1552.0 | 1106.344 |
| 1553.6000000000001 | 1108.676 |
| 1555.2 | 1110.762 |
| 1556.8000000000002 | 1108.471 |
| 1558.4 | 1110.023 |
| 1560.0 | 1111.96 |
| 1561.6000000000001 | 1105.756 |
| 1563.2 | 1108.748 |
| 1564.8000000000002 | 1109.523 |
| 1566.4 | 1112.216 |
| 1568.0 | 1105.758 |
| 1569.6000000000001 | 1104.917 |
| 1571.2 | 1099.077 |
| 1572.8000000000002 | 1101.585 |
| 1574.4 | 1103.052 |
| 1576.0 | 1095.559 |
| 1577.6000000000001 | 1101.102 |
| 1579.2 | 1092.475 |
| 1580.8000000000002 | 1092.572 |
| 1582.4 | 1091.755 |
| 1584.0 | 1086.38 |
| 1585.6000000000001 | 1088.903 |
| 1587.2 | 1090.988 |
| 1588.8000000000002 | 1091.903 |
| 1590.4 | 1093.955 |
| 1592.0 | 1091.722 |
| 1593.6000000000001 | 1092.628 |
| 1595.2 | 1086.497 |
| 1596.8000000000002 | 1090.289 |
| 1598.4 | 1094.795 |
| 1600.0 | 1089.88 |
| 1601.6000000000001 | 1090.335 |
| 1603.2 | 1088.454 |
| 1604.8000000000002 | 1090.483 |
| 1606.4 | 1089.207 |
| 1608.0 | 1092.708 |
| 1609.6000000000001 | 1088.563 |
| 1611.2 | 1090.497 |
| 1612.8000000000002 | 1092.451 |
| 1614.4 | 1091.974 |
| 1616.0 | 1091.781 |
| 1617.6000000000001 | 1093.498 |
| 1619.2 | 1093.014 |
| 1620.8000000000002 | 1091.296 |
| 1622.4 | 1091.938 |
| 1624.0 | 1088.034 |
| 1625.6000000000001 | 1092.593 |
| 1627.2 | 1091.781 |
| 1628.8000000000002 | 1094.16 |
| 1630.4 | 1092.736 |
| 1632.0 | 1087.881 |
| 1633.6000000000001 | 1093.218 |
| 1635.2 | 1092.9 |
| 1636.8000000000002 | 1088.804 |
| 1638.4 | 1091.346 |
| 1640.0 | 1088.86 |
| 1641.6000000000001 | 1089.707 |
| 1643.2 | 1097.261 |
| 1644.8000000000002 | 1094.127 |
| 1646.4 | 1096.049 |
| 1648.0 | 1094.458 |
| 1649.6000000000001 | 1093.113 |
| 1651.2 | 1094.437 |
| 1652.8000000000002 | 1093.932 |
| 1654.4 | 1096.897 |
| 1656.0 | 1092.651 |
| 1657.6000000000001 | 1093.719 |
| 1659.2 | 1094.093 |
| 1660.8000000000002 | 1095.64 |
| 1662.4 | 1098.593 |
| 1664.0 | 1096.608 |
| 1665.6000000000001 | 1096.59 |
| 1667.2 | 1096.463 |
| 1668.8000000000002 | 1096.926 |
| 1670.4 | 1099.377 |
| 1672.0 | 1102.154 |
| 1673.6000000000001 | 1098.187 |
| 1675.2 | 1102.438 |
| 1676.8000000000002 | 1097.943 |
| 1678.4 | 1097.887 |
| 1680.0 | 1100.986 |
| 1681.6000000000001 | 1098.608 |
| 1683.2 | 1103.539 |
| 1684.8000000000002 | 1101.506 |
| 1686.4 | 1105.539 |
| 1688.0 | 1104.778 |
| 1689.6000000000001 | 1101.522 |
| 1691.2 | 1101.052 |
| 1692.8000000000002 | 1106.64 |
| 1694.4 | 1106.645 |
| 1696.0 | 1106.079 |
| 1697.6000000000001 | 1107.239 |
| 1699.2 | 1108.694 |
| 1700.8000000000002 | 1108.128 |
| 1702.4 | 1106.822 |
| 1704.0 | 1110.525 |
| 1705.6000000000001 | 1109.606 |
| 1707.2 | 1110.68 |
| 1708.8000000000002 | 1109.224 |
| 1710.4 | 1114.764 |
| 1712.0 | 1116.551 |
| 1713.6000000000001 | 1114.21 |
| 1715.2 | 1111.71 |
| 1716.8000000000002 | 1113.167 |
| 1718.4 | 1119.25 |
| 1720.0 | 1114.458 |
| 1721.6000000000001 | 1120.142 |
| 1723.2 | 1115.599 |
| 1724.8000000000002 | 1116.364 |
| 1726.4 | 1114.019 |
| 1728.0 | 1118.338 |
| 1729.6000000000001 | 1118.66 |
| 1731.2 | 1119.16 |
| 1732.8000000000002 | 1123.026 |
| 1734.4 | 1119.705 |
| 1736.0 | 1120.424 |
| 1737.6000000000001 | 1119.989 |
| 1739.2 | 1122.735 |
| 1740.8000000000002 | 1127.654 |
| 1742.4 | 1128.91 |
| 1744.0 | 1127.225 |
| 1745.6000000000001 | 1133.429 |
| 1747.2 | 1132.224 |
| 1748.8000000000002 | 1132.031 |
| 1750.4 | 1136.08 |
| 1752.0 | 1137.344 |
| 1753.6000000000001 | 1135.525 |
| 1755.2 | 1141.18 |
| 1756.8000000000002 | 1145.847 |
| 1758.4 | 1141.245 |
| 1760.0 | 1146.721 |
| 1761.6000000000001 | 1144.543 |
| 1763.2 | 1147.69 |
| 1764.8000000000002 | 1145.974 |
| 1766.4 | 1151.68 |
| 1768.0 | 1150.966 |
| 1769.6000000000001 | 1153.313 |
| 1771.2 | 1149.997 |
| 1772.8000000000002 | 1155.87 |
| 1774.4 | 1158.253 |
| 1776.0 | 1156.894 |
| 1777.6000000000001 | 1161.58 |
| 1779.2 | 1158.972 |
| 1780.8000000000002 | 1159.721 |
| 1782.4 | 1163.211 |
| 1784.0 | 1159.37 |
| 1785.6000000000001 | 1158.366 |
| 1787.2 | 1165.65 |
| 1788.8000000000002 | 1162.873 |
| 1790.4 | 1164.265 |
| 1792.0 | 1164.753 |
| 1793.6000000000001 | 1163.407 |
| 1795.2 | 1167.75 |
| 1796.8000000000002 | 1171.096 |
| 1798.4 | 1165.773 |
| 1800.0 | 1169.133 |
| 1801.6000000000001 | 1170.173 |
| 1803.2 | 1168.778 |
| 1804.8000000000002 | 1167.457 |
| 1806.4 | 1164.341 |
| 1808.0 | 1169.96 |
| 1809.6000000000001 | 1164.892 |
| 1811.2 | 1174.282 |
| 1812.8000000000002 | 1169.688 |
| 1814.4 | 1166.434 |
| 1816.0 | 1168.58 |
| 1817.6000000000001 | 1172.714 |
| 1819.2 | 1167.822 |
| 1820.8000000000002 | 1168.769 |
| 1822.4 | 1168.909 |
| 1824.0 | 1167.86 |
| 1825.6000000000001 | 1169.619 |
| 1827.2 | 1170.992 |
| 1828.8000000000002 | 1166.571 |
| 1830.4 | 1167.974 |
| 1832.0 | 1168.756 |
| 1833.6000000000001 | 1169.623 |
| 1835.2 | 1165.904 |
| 1836.8000000000002 | 1167.054 |
| 1838.4 | 1166.005 |
| 1840.0 | 1168.037 |
| 1841.6000000000001 | 1167.463 |
| 1843.2 | 1171.415 |
| 1844.8000000000002 | 1167.443 |
| 1846.4 | 1161.66 |
| 1848.0 | 1166.052 |
| 1849.6000000000001 | 1162.38 |
| 1851.2 | 1160.633 |
| 1852.8000000000002 | 1156.644 |
| 1854.4 | 1162.656 |
| 1856.0 | 1161.678 |
| 1857.6000000000001 | 1157.042 |
| 1859.2 | 1155.103 |
| 1860.8000000000002 | 1154.917 |
| 1862.4 | 1157.5 |
| 1864.0 | 1156.98 |
| 1865.6000000000001 | 1149.252 |
| 1867.2 | 1152.693 |
| 1868.8000000000002 | 1151.883 |
| 1870.4 | 1153.293 |
| 1872.0 | 1150.037 |
| 1873.6000000000001 | 1151.292 |
| 1875.2 | 1149.512 |
| 1876.8000000000002 | 1146.963 |
| 1878.4 | 1145.18 |
| 1880.0 | 1150.17 |
| 1881.6000000000001 | 1145.039 |
| 1883.2 | 1146.188 |
| 1884.8000000000002 | 1145.745 |
| 1886.4 | 1146.937 |
| 1888.0 | 1148.952 |
| 1889.6000000000001 | 1145.813 |
| 1891.2 | 1150.005 |
| 1892.8000000000002 | 1140.571 |
| 1894.4 | 1143.279 |
| 1896.0 | 1145.38 |
| 1897.6000000000001 | 1141.549 |
| 1899.2 | 1142.205 |
| 1900.8000000000002 | 1139.432 |
| 1902.4 | 1139.338 |
| 1904.0 | 1141.131 |
| 1905.6000000000001 | 1137.887 |
| 1907.2 | 1140.019 |
| 1908.8000000000002 | 1142.284 |
| 1910.4 | 1141.708 |
| 1912.0 | 1137.519 |
| 1913.6000000000001 | 1137.809 |
| 1915.2 | 1144.33 |
| 1916.8000000000002 | 1136.998 |
| 1918.4 | 1137.401 |
| 1920.0 | 1139.123 |
| 1921.6000000000001 | 1133.457 |
| 1923.2 | 1135.847 |
| 1924.8000000000002 | 1135.995 |
| 1926.4 | 1134.539 |
| 1928.0 | 1140.066 |
| 1929.6000000000001 | 1134.637 |
| 1931.2 | 1136.73 |
| 1932.8000000000002 | 1140.586 |
| 1934.4 | 1136.174 |
| 1936.0 | 1137.09 |
| 1937.6000000000001 | 1138.775 |
| 1939.2 | 1137.955 |
| 1940.8000000000002 | 1135.019 |
| 1942.4 | 1137.622 |
| 1944.0 | 1135.981 |
| 1945.6000000000001 | 1139.515 |
| 1947.2 | 1139.466 |
| 1948.8000000000002 | 1142.194 |
| 1950.4 | 1142.211 |
| 1952.0 | 1141.361 |
| 1953.6000000000001 | 1140.401 |
| 1955.2 | 1144.648 |
| 1956.8000000000002 | 1141.375 |
| 1958.4 | 1137.353 |
| 1960.0 | 1147.002 |
| 1961.6000000000001 | 1140.946 |
| 1963.2 | 1141.662 |
| 1964.8000000000002 | 1142.264 |
| 1966.4 | 1141.009 |
| 1968.0 | 1143.693 |
| 1969.6000000000001 | 1146.877 |
| 1971.2 | 1144.292 |
| 1972.8000000000002 | 1147.921 |
| 1974.4 | 1143.102 |
| 1976.0 | 1147.81 |
| 1977.6000000000001 | 1146.509 |
| 1979.2 | 1145.164 |
| 1980.8000000000002 | 1148.12 |
| 1982.4 | 1149.926 |
| 1984.0 | 1145.929 |
| 1985.6000000000001 | 1148.057 |
| 1987.2 | 1152.647 |
| 1988.8000000000002 | 1148.264 |
| 1990.4 | 1152.449 |
| 1992.0 | 1154.593 |
| 1993.6000000000001 | 1156.21 |
| 1995.2 | 1156.753 |